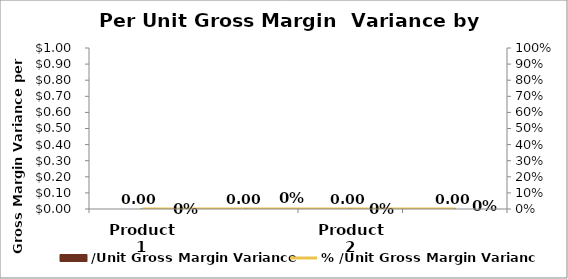
| Category | /Unit Gross Margin Variance |
|---|---|
| Product 1 | 0 |
| Product 2 | 0 |
| Product 3 | 0 |
| All Products | 0 |